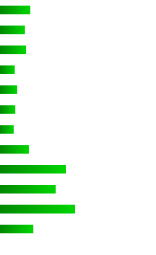
| Category | Series 0 |
|---|---|
| 0 | 758089 |
| 1 | 620299 |
| 2 | 650678 |
| 3 | 356740 |
| 4 | 418574 |
| 5 | 368757 |
| 6 | 332204 |
| 7 | 726194 |
| 8 | 1687112 |
| 9 | 1421920 |
| 10 | 1922685 |
| 11 | 836500 |